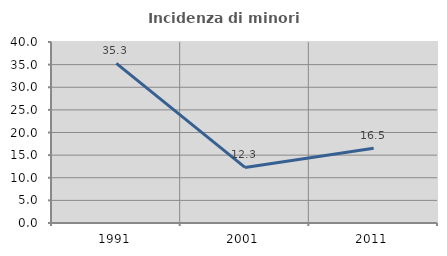
| Category | Incidenza di minori stranieri |
|---|---|
| 1991.0 | 35.294 |
| 2001.0 | 12.281 |
| 2011.0 | 16.509 |